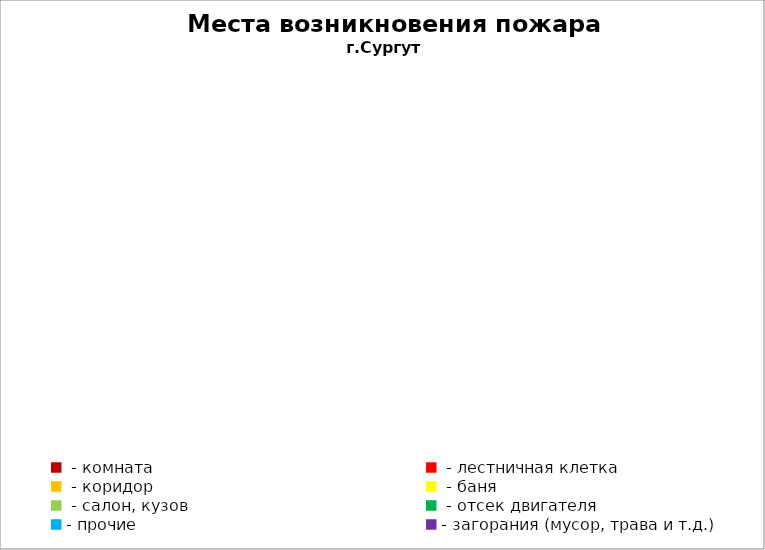
| Category | Места возникновения пожара |
|---|---|
|  - комната | 98 |
|  - лестничная клетка | 19 |
|  - коридор | 14 |
|  - баня | 51 |
|  - салон, кузов | 31 |
|  - отсек двигателя | 64 |
| - прочие | 131 |
| - загорания (мусор, трава и т.д.)  | 192 |